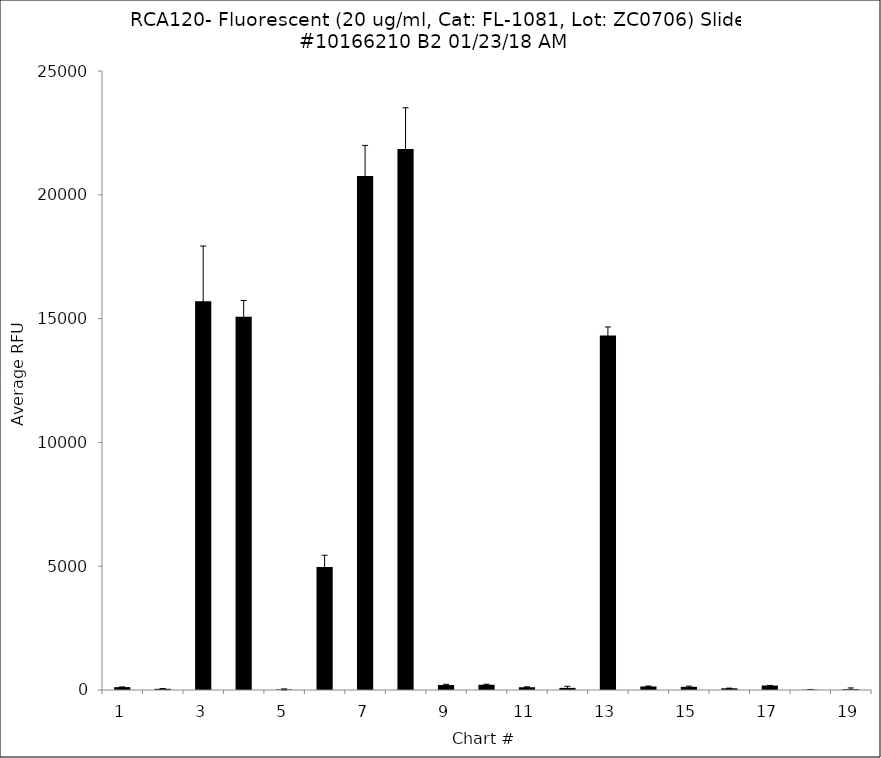
| Category | Series 0 |
|---|---|
| 1.0 | 115.5 |
| 2.0 | 48.25 |
| 3.0 | 15702 |
| 4.0 | 15070.75 |
| 5.0 | 22.75 |
| 6.0 | 4972.5 |
| 7.0 | 20757.25 |
| 8.0 | 21849.75 |
| 9.0 | 200.5 |
| 10.0 | 211.75 |
| 11.0 | 111.25 |
| 12.0 | 86.25 |
| 13.0 | 14320 |
| 14.0 | 142.5 |
| 15.0 | 129.25 |
| 16.0 | 68 |
| 17.0 | 179.5 |
| 18.0 | 9.75 |
| 19.0 | 35.5 |